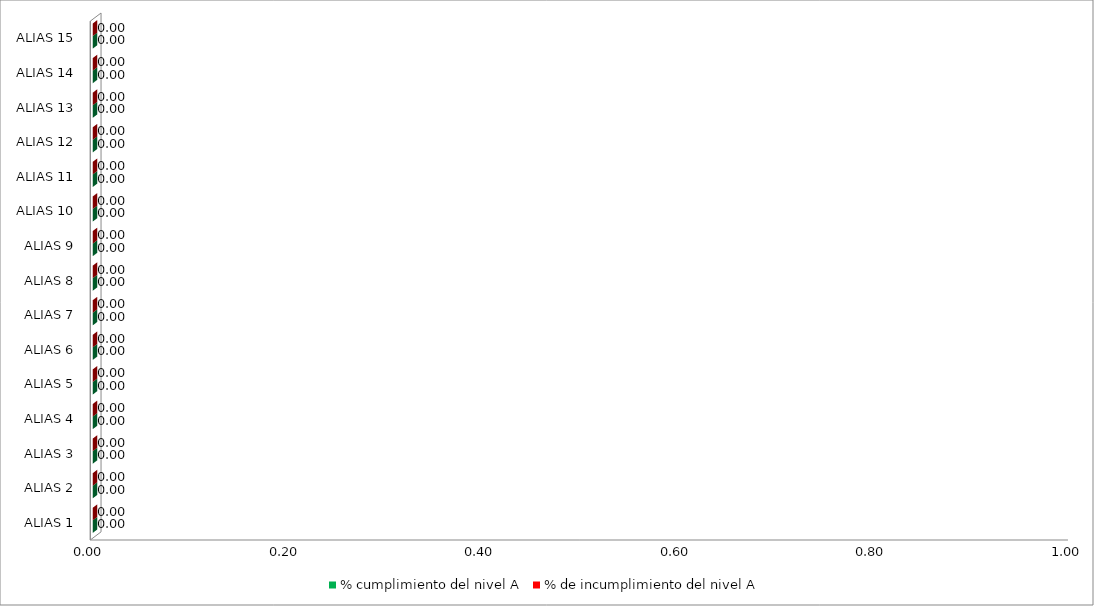
| Category | % cumplimiento del nivel A | % de incumplimiento del nivel A |
|---|---|---|
| ALIAS 1 | 0 | 0 |
| ALIAS 2 | 0 | 0 |
| ALIAS 3 | 0 | 0 |
| ALIAS 4 | 0 | 0 |
| ALIAS 5 | 0 | 0 |
| ALIAS 6 | 0 | 0 |
| ALIAS 7 | 0 | 0 |
| ALIAS 8 | 0 | 0 |
| ALIAS 9 | 0 | 0 |
| ALIAS 10 | 0 | 0 |
| ALIAS 11 | 0 | 0 |
| ALIAS 12 | 0 | 0 |
| ALIAS 13 | 0 | 0 |
| ALIAS 14 | 0 | 0 |
| ALIAS 15 | 0 | 0 |